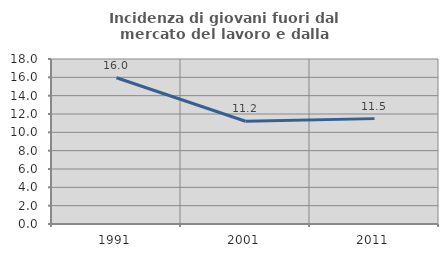
| Category | Incidenza di giovani fuori dal mercato del lavoro e dalla formazione  |
|---|---|
| 1991.0 | 15.958 |
| 2001.0 | 11.205 |
| 2011.0 | 11.495 |